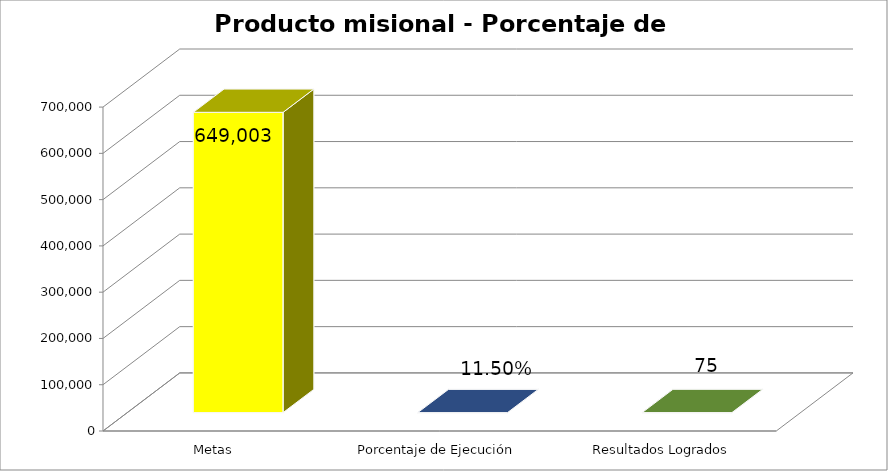
| Category | Series 0 |
|---|---|
| Metas | 649003 |
| Porcentaje de Ejecución | 0.115 |
| Resultados Logrados | 75 |